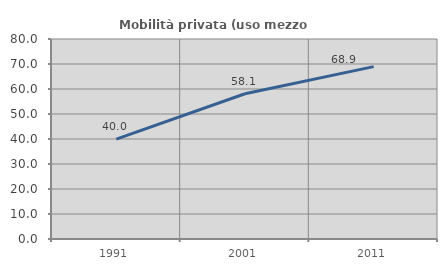
| Category | Mobilità privata (uso mezzo privato) |
|---|---|
| 1991.0 | 39.952 |
| 2001.0 | 58.096 |
| 2011.0 | 68.95 |